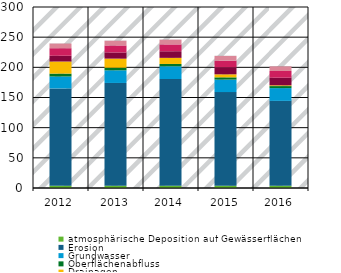
| Category | atmosphärische Deposition auf Gewässerflächen | Erosion | Grundwasser | Oberflächenabfluss | Drainagen | urbane Gebiete (Kanalisationssysteme) | industrielle Direkteinleiter | kommunale Kläranlagen | historischer Bergbau |
|---|---|---|---|---|---|---|---|---|---|
| 2012.0 | 3.772 | 161.269 | 19.731 | 4.843 | 20 | 9.581 | 12.521 | 7.616 | 0.323 |
| 2013.0 | 3.772 | 170.331 | 20.922 | 4.357 | 15.056 | 10.236 | 11.622 | 7.668 | 0.323 |
| 2014.0 | 3.772 | 176.904 | 21.006 | 3.9 | 10.124 | 10.925 | 11.38 | 7.7 | 0.323 |
| 2015.0 | 3.772 | 155.19 | 20.74 | 3.702 | 5.005 | 11.639 | 11.063 | 7.634 | 0.323 |
| 2016.0 | 3.772 | 140.649 | 21.146 | 3.365 | 1.261 | 12.577 | 11.205 | 7.666 | 0.323 |